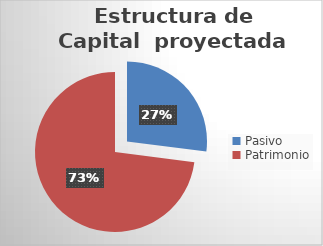
| Category | Series 0 |
|---|---|
| Pasivo  | 0.27 |
| Patrimonio  | 0.73 |